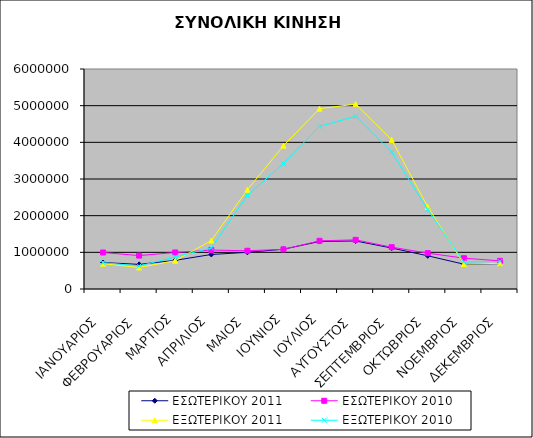
| Category | ΕΣΩΤΕΡΙΚΟΥ 2011 | ΕΣΩΤΕΡΙΚΟΥ 2010 | ΕΞΩΤΕΡΙΚΟΥ 2011 | ΕΞΩΤΕΡΙΚΟΥ 2010 |
|---|---|---|---|---|
| ΙΑΝΟΥΑΡΙΟΣ | 721027 | 995741 | 690447 | 715921 |
| ΦΕΒΡΟΥΑΡΙΟΣ | 671939 | 910795 | 586949 | 629896 |
| ΜΑΡΤΙΟΣ | 781323 | 995814 | 772105 | 873552 |
| ΑΠΡΙΛΙΟΣ | 941397 | 1061434 | 1321447 | 1118941 |
| ΜΑΙΟΣ | 999706 | 1042777 | 2707386 | 2552050 |
| ΙΟΥΝΙΟΣ | 1085296 | 1080929 | 3908577 | 3422267 |
| ΙΟΥΛΙΟΣ | 1296239 | 1313789 | 4917320 | 4436406 |
| ΑΥΓΟΥΣΤΟΣ | 1309822 | 1340207 | 5042617 | 4708164 |
| ΣΕΠΤΕΜΒΡΙΟΣ | 1117006 | 1140560 | 4066836 | 3730670 |
| ΟΚΤΩΒΡΙΟΣ | 905226 | 977863 | 2239166 | 2160969 |
| ΝΟΕΜΒΡΙΟΣ | 676598 | 840411 | 681422 | 735388 |
| ΔΕΚΕΜΒΡΙΟΣ | 691989 | 767141 | 699482 | 751888 |